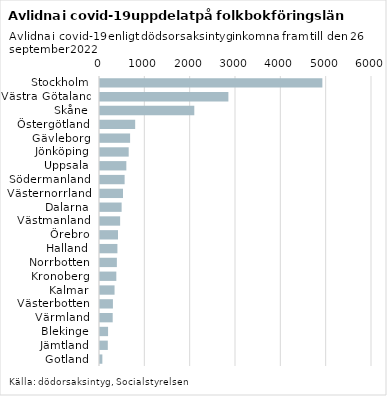
| Category | Series 0 |
|---|---|
| Stockholm | 4905 |
| Västra Götaland | 2832 |
| Skåne | 2080 |
| Östergötland | 776 |
| Gävleborg | 664 |
| Jönköping | 633 |
| Uppsala | 581 |
| Södermanland | 543 |
| Västernorrland | 507 |
| Dalarna | 477 |
| Västmanland | 444 |
| Örebro | 397 |
| Halland | 384 |
| Norrbotten | 372 |
| Kronoberg | 360 |
| Kalmar | 321 |
| Västerbotten | 285 |
| Värmland | 280 |
| Blekinge | 178 |
| Jämtland | 172 |
| Gotland | 52 |